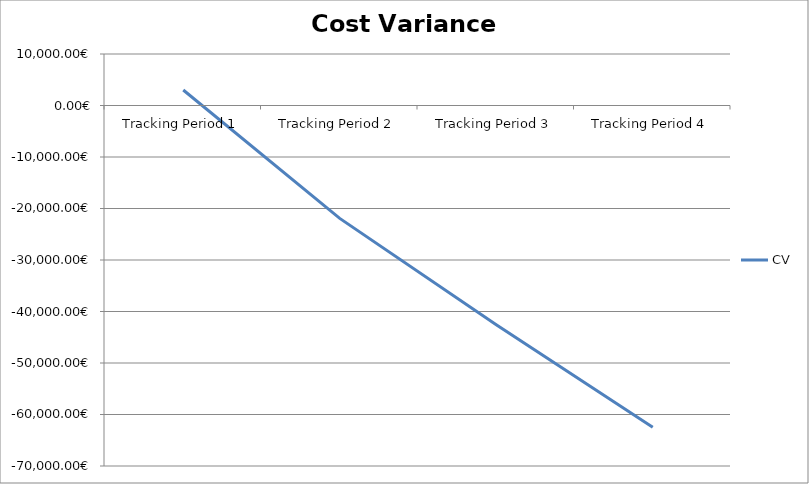
| Category | CV |
|---|---|
| Tracking Period 1 | 3016 |
| Tracking Period 2 | -21919 |
| Tracking Period 3 | -42581 |
| Tracking Period 4 | -62457 |